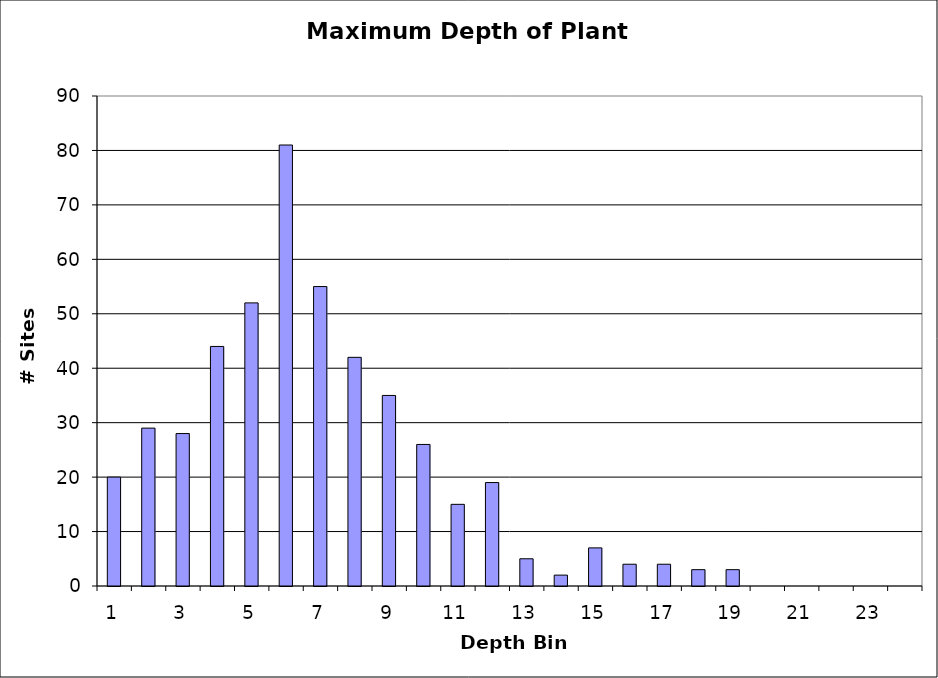
| Category | Series 0 |
|---|---|
| 1.0 | 20 |
| 2.0 | 29 |
| 3.0 | 28 |
| 4.0 | 44 |
| 5.0 | 52 |
| 6.0 | 81 |
| 7.0 | 55 |
| 8.0 | 42 |
| 9.0 | 35 |
| 10.0 | 26 |
| 11.0 | 15 |
| 12.0 | 19 |
| 13.0 | 5 |
| 14.0 | 2 |
| 15.0 | 7 |
| 16.0 | 4 |
| 17.0 | 4 |
| 18.0 | 3 |
| 19.0 | 3 |
| 20.0 | 0 |
| 21.0 | 0 |
| 22.0 | 0 |
| 23.0 | 0 |
| 24.0 | 0 |